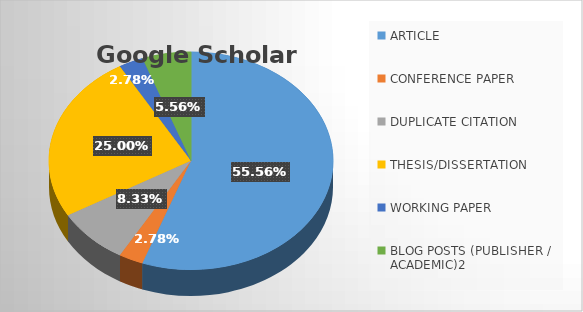
| Category | Total |
|---|---|
| ARTICLE | 20 |
| CONFERENCE PAPER | 1 |
| DUPLICATE CITATION | 3 |
| THESIS/DISSERTATION | 9 |
| WORKING PAPER | 1 |
| BLOG POSTS (PUBLISHER / ACADEMIC)2 | 2 |